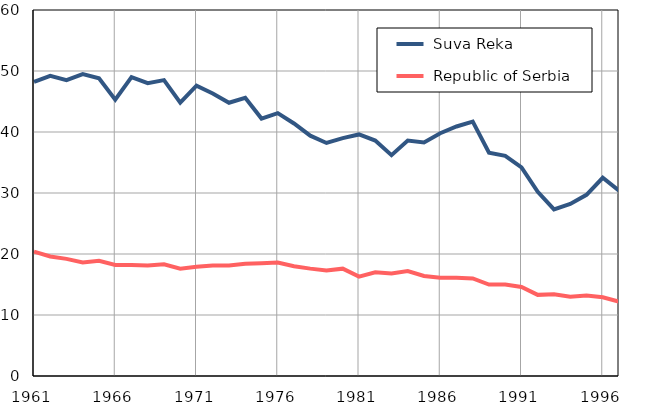
| Category |  Suva Reka |  Republic of Serbia |
|---|---|---|
| 1961.0 | 48.2 | 20.4 |
| 1962.0 | 49.2 | 19.6 |
| 1963.0 | 48.5 | 19.2 |
| 1964.0 | 49.5 | 18.6 |
| 1965.0 | 48.8 | 18.9 |
| 1966.0 | 45.3 | 18.2 |
| 1967.0 | 49 | 18.2 |
| 1968.0 | 48 | 18.1 |
| 1969.0 | 48.5 | 18.3 |
| 1970.0 | 44.8 | 17.6 |
| 1971.0 | 47.6 | 17.9 |
| 1972.0 | 46.3 | 18.1 |
| 1973.0 | 44.8 | 18.1 |
| 1974.0 | 45.6 | 18.4 |
| 1975.0 | 42.2 | 18.5 |
| 1976.0 | 43.1 | 18.6 |
| 1977.0 | 41.4 | 18 |
| 1978.0 | 39.4 | 17.6 |
| 1979.0 | 38.2 | 17.3 |
| 1980.0 | 39 | 17.6 |
| 1981.0 | 39.6 | 16.3 |
| 1982.0 | 38.6 | 17 |
| 1983.0 | 36.2 | 16.8 |
| 1984.0 | 38.6 | 17.2 |
| 1985.0 | 38.3 | 16.4 |
| 1986.0 | 39.8 | 16.1 |
| 1987.0 | 40.9 | 16.1 |
| 1988.0 | 41.7 | 16 |
| 1989.0 | 36.6 | 15 |
| 1990.0 | 36.1 | 15 |
| 1991.0 | 34.2 | 14.6 |
| 1992.0 | 30.2 | 13.3 |
| 1993.0 | 27.3 | 13.4 |
| 1994.0 | 28.2 | 13 |
| 1995.0 | 29.7 | 13.2 |
| 1996.0 | 32.5 | 12.9 |
| 1997.0 | 30.4 | 12.2 |